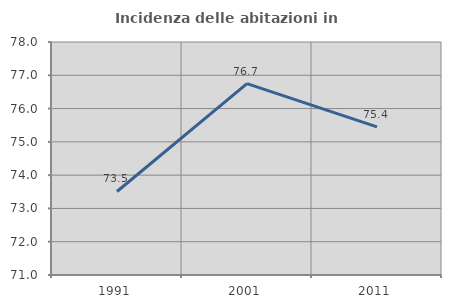
| Category | Incidenza delle abitazioni in proprietà  |
|---|---|
| 1991.0 | 73.509 |
| 2001.0 | 76.75 |
| 2011.0 | 75.449 |